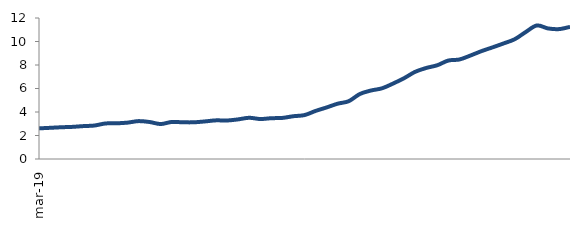
| Category | Series 0 |
|---|---|
| 2019-03-01 | 2.609 |
| 2019-04-01 | 2.653 |
| 2019-05-01 | 2.702 |
| 2019-06-01 | 2.733 |
| 2019-07-01 | 2.799 |
| 2019-08-01 | 2.847 |
| 2019-09-01 | 3.023 |
| 2019-10-01 | 3.036 |
| 2019-11-01 | 3.095 |
| 2019-12-01 | 3.225 |
| 2020-01-01 | 3.148 |
| 2020-02-01 | 2.975 |
| 2020-03-01 | 3.153 |
| 2020-04-01 | 3.122 |
| 2020-05-01 | 3.123 |
| 2020-06-01 | 3.198 |
| 2020-07-01 | 3.289 |
| 2020-08-01 | 3.275 |
| 2020-09-01 | 3.372 |
| 2020-10-01 | 3.508 |
| 2020-11-01 | 3.402 |
| 2020-12-01 | 3.472 |
| 2021-01-01 | 3.496 |
| 2021-02-01 | 3.642 |
| 2021-03-01 | 3.737 |
| 2021-04-01 | 4.091 |
| 2021-05-01 | 4.388 |
| 2021-06-01 | 4.708 |
| 2021-07-01 | 4.92 |
| 2021-08-01 | 5.531 |
| 2021-09-01 | 5.826 |
| 2021-10-01 | 6.015 |
| 2021-11-01 | 6.418 |
| 2021-12-01 | 6.877 |
| 2022-01-01 | 7.419 |
| 2022-02-01 | 7.746 |
| 2022-03-01 | 7.979 |
| 2022-04-01 | 8.38 |
| 2022-05-01 | 8.468 |
| 2022-06-01 | 8.806 |
| 2022-07-01 | 9.181 |
| 2022-08-01 | 9.501 |
| 2022-09-01 | 9.836 |
| 2022-10-01 | 10.192 |
| 2022-11-01 | 10.808 |
| 2022-12-01 | 11.364 |
| 2023-01-01 | 11.115 |
| 2023-02-01 | 11.054 |
| 2023-03-01 | 11.245 |